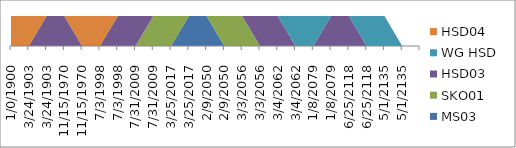
| Category | MS03 | SKO01 | HSD03 | WG HSD | HSD04 |
|---|---|---|---|---|---|
| 1/0/1900 | 0 | 0 | 0 | 0 | 1 |
| 3/24/1903 | 0 | 0 | 0 | 0 | 1 |
| 3/24/1903 | 0 | 0 | 1 | 0 | 0 |
| 11/15/1970 | 0 | 0 | 1 | 0 | 0 |
| 11/15/1970 | 0 | 0 | 0 | 0 | 1 |
| 7/3/1998 | 0 | 0 | 0 | 0 | 1 |
| 7/3/1998 | 0 | 0 | 1 | 0 | 0 |
| 7/31/2009 | 0 | 0 | 1 | 0 | 0 |
| 7/31/2009 | 0 | 1 | 0 | 0 | 0 |
| 3/25/2017 | 0 | 1 | 0 | 0 | 0 |
| 3/25/2017 | 1 | 0 | 0 | 0 | 0 |
| 2/9/2050 | 1 | 0 | 0 | 0 | 0 |
| 2/9/2050 | 0 | 1 | 0 | 0 | 0 |
| 3/3/2056 | 0 | 1 | 0 | 0 | 0 |
| 3/3/2056 | 0 | 0 | 1 | 0 | 0 |
| 3/4/2062 | 0 | 0 | 1 | 0 | 0 |
| 3/4/2062 | 0 | 0 | 0 | 1 | 0 |
| 1/8/2079 | 0 | 0 | 0 | 1 | 0 |
| 1/8/2079 | 0 | 0 | 1 | 0 | 0 |
| 6/25/2118 | 0 | 0 | 1 | 0 | 0 |
| 6/25/2118 | 0 | 0 | 0 | 1 | 0 |
| 5/1/2135 | 0 | 0 | 0 | 1 | 0 |
| 5/1/2135 | 0 | 0 | 0 | 0 | 0 |